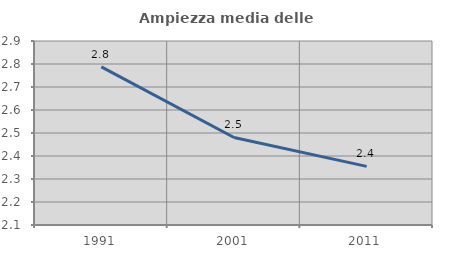
| Category | Ampiezza media delle famiglie |
|---|---|
| 1991.0 | 2.788 |
| 2001.0 | 2.481 |
| 2011.0 | 2.355 |